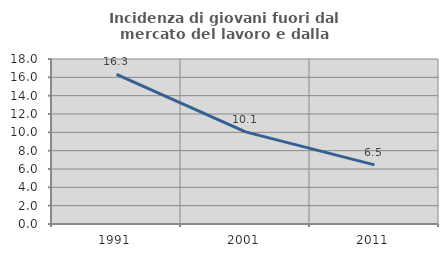
| Category | Incidenza di giovani fuori dal mercato del lavoro e dalla formazione  |
|---|---|
| 1991.0 | 16.327 |
| 2001.0 | 10.053 |
| 2011.0 | 6.452 |